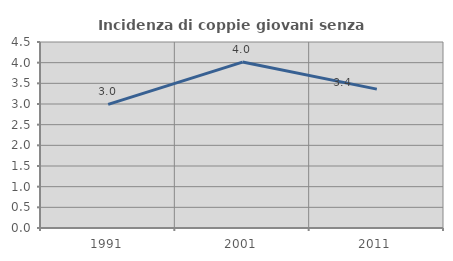
| Category | Incidenza di coppie giovani senza figli |
|---|---|
| 1991.0 | 2.992 |
| 2001.0 | 4.014 |
| 2011.0 | 3.359 |